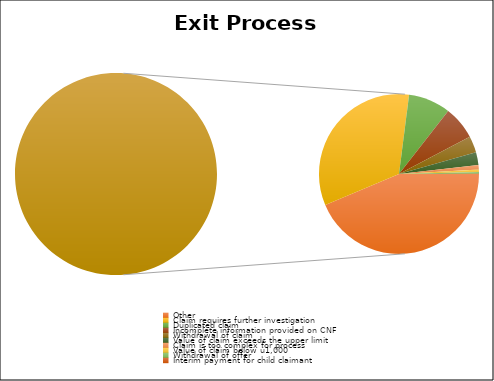
| Category | Total |
|---|---|
| Other | 33146 |
| Claim requires further investigation | 25311 |
| Duplicated claim | 6465 |
| Incomplete information provided on CNF | 5124 |
| Withdrawal of claim | 2547 |
| Value of claim exceeds the upper limit | 1946 |
| Claim is too complex for process | 691 |
| Value of claim below ú1,000 | 385 |
| Withdrawal of offer | 233 |
| Interim payment for child claimant | 53 |